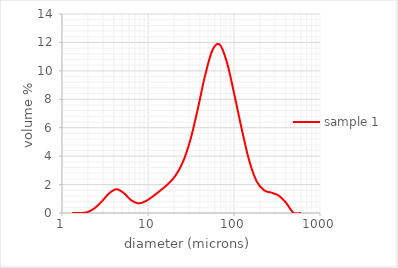
| Category | sample 1 |
|---|---|
| 1.32 | 0 |
| 1.6 | 0 |
| 1.95 | 0.05 |
| 2.38 | 0.328 |
| 2.9 | 0.811 |
| 3.53 | 1.384 |
| 4.3 | 1.674 |
| 5.24 | 1.399 |
| 6.39 | 0.892 |
| 7.78 | 0.676 |
| 9.48 | 0.844 |
| 11.55 | 1.195 |
| 14.08 | 1.605 |
| 17.15 | 2.048 |
| 20.9 | 2.634 |
| 25.46 | 3.588 |
| 31.01 | 5.124 |
| 37.79 | 7.273 |
| 46.03 | 9.656 |
| 56.09 | 11.456 |
| 68.33 | 11.842 |
| 83.26 | 10.543 |
| 101.44 | 8.274 |
| 123.59 | 5.848 |
| 150.57001 | 3.666 |
| 183.44 | 2.228 |
| 223.50999 | 1.598 |
| 272.31 | 1.432 |
| 331.76999 | 1.22 |
| 404.20999 | 0.706 |
| 492.47 | 0.007 |
| 600.0 | 0 |